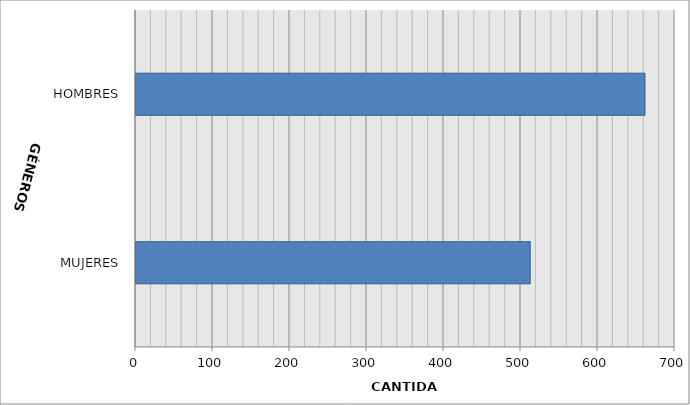
| Category | Series 0 |
|---|---|
| MUJERES | 512 |
| HOMBRES | 661 |